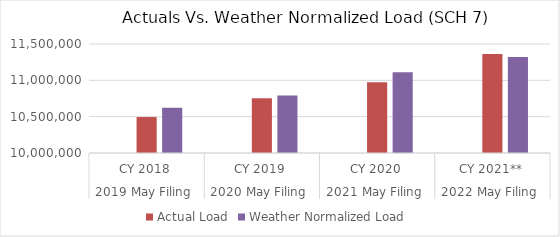
| Category | Residential: SCH 7 | Actual Load | Weather Normalized Load  |
|---|---|---|---|
| 0 |  | 10494946.738 | 10623030.236 |
| 1 |  | 10754253.364 | 10789989.4 |
| 2 |  | 10973601.531 | 11112505.876 |
| 3 |  | 11363962.066 | 11322290.839 |